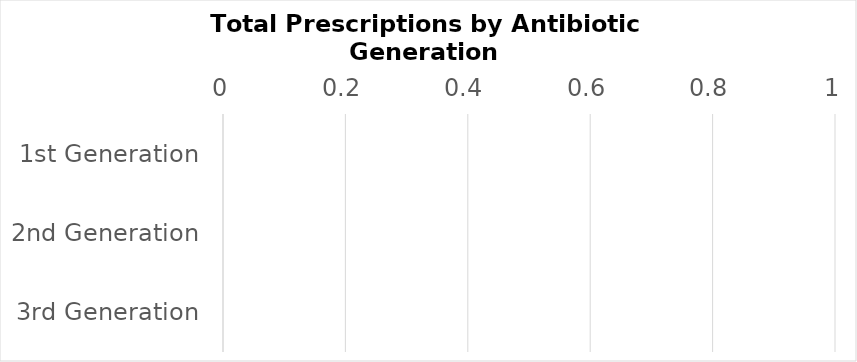
| Category | Series 0 |
|---|---|
| 1st Generation | 0 |
| 2nd Generation | 0 |
| 3rd Generation | 0 |